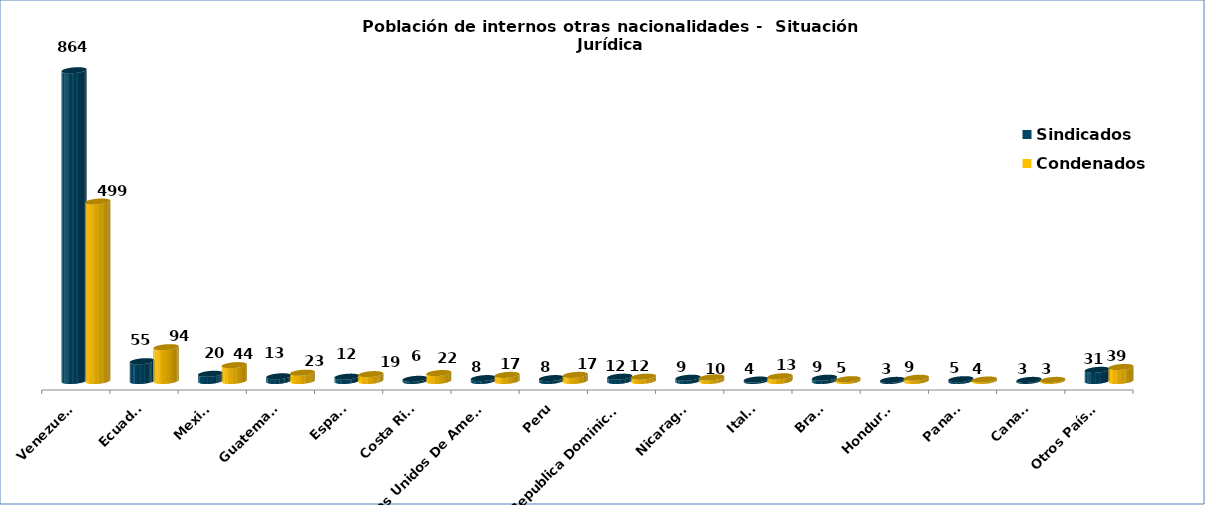
| Category | Sindicados | Condenados |
|---|---|---|
| Venezuela | 864 | 499 |
| Ecuador | 55 | 94 |
| Mexico | 20 | 44 |
| Guatemala | 13 | 23 |
| Espana | 12 | 19 |
| Costa Rica | 6 | 22 |
| Estados Unidos De America | 8 | 17 |
| Peru | 8 | 17 |
| Republica Dominicana | 12 | 12 |
| Nicaragua | 9 | 10 |
| Italia | 4 | 13 |
| Brasil | 9 | 5 |
| Honduras | 3 | 9 |
| Panama | 5 | 4 |
| Canada | 3 | 3 |
| Otros Países | 31 | 39 |